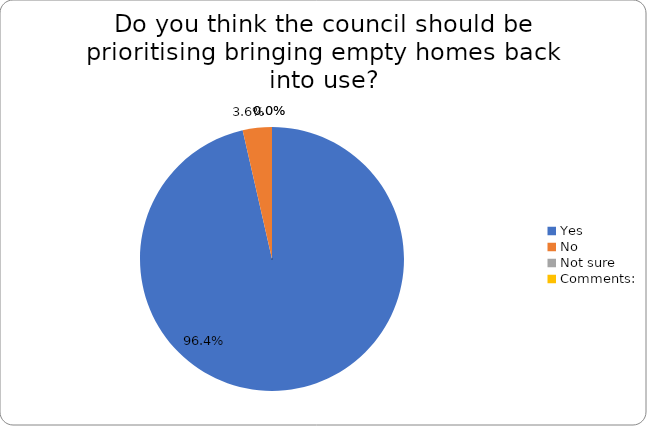
| Category | Series 0 |
|---|---|
| Yes | 0.964 |
| No | 0.036 |
| Not sure | 0 |
| Comments: | 0 |